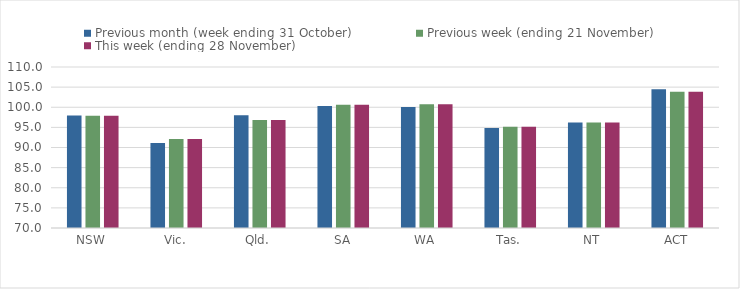
| Category | Previous month (week ending 31 October) | Previous week (ending 21 November) | This week (ending 28 November) |
|---|---|---|---|
| NSW | 97.95 | 97.86 | 97.86 |
| Vic. | 91.11 | 92.1 | 92.1 |
| Qld. | 97.99 | 96.82 | 96.82 |
| SA | 100.34 | 100.65 | 100.65 |
| WA | 100.09 | 100.73 | 100.73 |
| Tas. | 94.83 | 95.13 | 95.13 |
| NT | 96.2 | 96.2 | 96.2 |
| ACT | 104.5 | 103.84 | 103.84 |